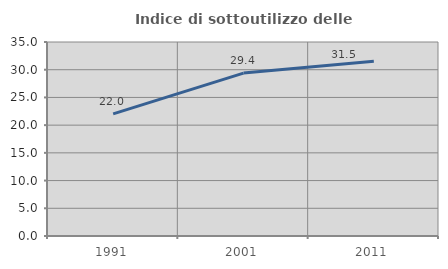
| Category | Indice di sottoutilizzo delle abitazioni  |
|---|---|
| 1991.0 | 22.044 |
| 2001.0 | 29.392 |
| 2011.0 | 31.54 |